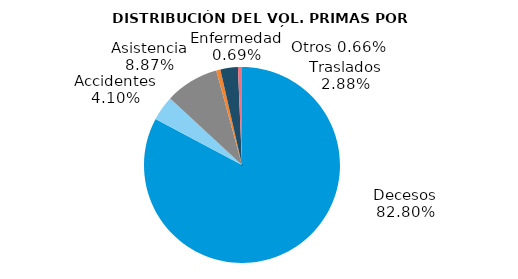
| Category | Series 0 |
|---|---|
| Decesos | 0.828 |
| Accidentes | 0.041 |
| Asistencia | 0.089 |
| Enfermedad | 0.007 |
| Traslados | 0.029 |
| Otros | 0.007 |